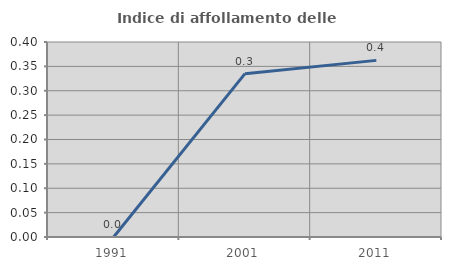
| Category | Indice di affollamento delle abitazioni  |
|---|---|
| 1991.0 | 0 |
| 2001.0 | 0.335 |
| 2011.0 | 0.362 |